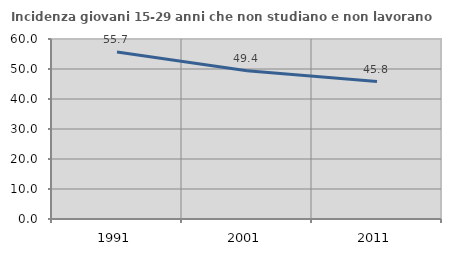
| Category | Incidenza giovani 15-29 anni che non studiano e non lavorano  |
|---|---|
| 1991.0 | 55.665 |
| 2001.0 | 49.424 |
| 2011.0 | 45.81 |